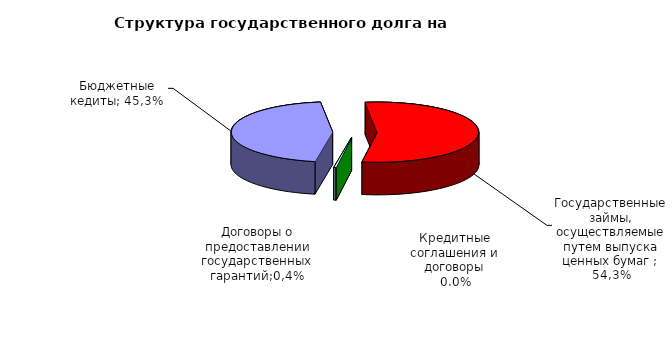
| Category | Series 0 |
|---|---|
| Договоры и соглашения о получении бюджетных кредитов от бюджетов других уровней бюджетной системы  | 31945227.963 |
| Государственные займы, осуществляемые путем выпуска ценных бумаг  | 38300000 |
| Кредитные соглашения и договоры | 0 |
| Договоры о предоставлении государственных гарантий | 253223.16 |